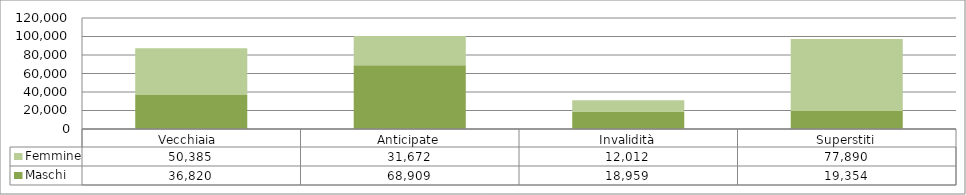
| Category | Maschi | Femmine |
|---|---|---|
| Vecchiaia  | 36820 | 50385 |
| Anticipate | 68909 | 31672 |
| Invalidità | 18959 | 12012 |
| Superstiti | 19354 | 77890 |